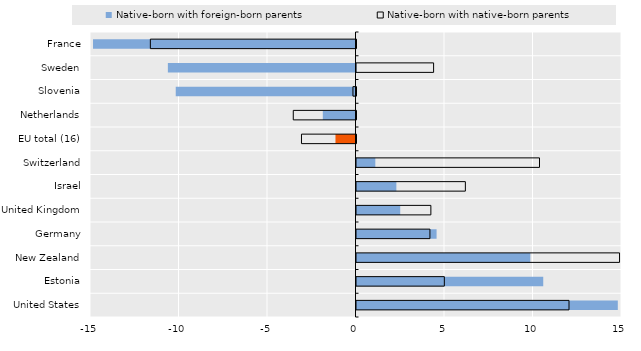
| Category | Native-born with foreign-born parents | Native-born with native-born parents  |
|---|---|---|
| France | -14.829 | -11.618 |
| Sweden | -10.601 | 4.356 |
| Slovenia | -10.156 | -0.172 |
| Netherlands | -1.847 | -3.544 |
| EU total (16) | -1.132 | -3.08 |
| Switzerland | 1.064 | 10.339 |
| Israel | 2.252 | 6.151 |
| United Kingdom | 2.47 | 4.202 |
| Germany | 4.525 | 4.148 |
| New Zealand | 9.821 | 14.861 |
| Estonia | 10.55 | 4.962 |
| United States | 14.763 | 12.006 |